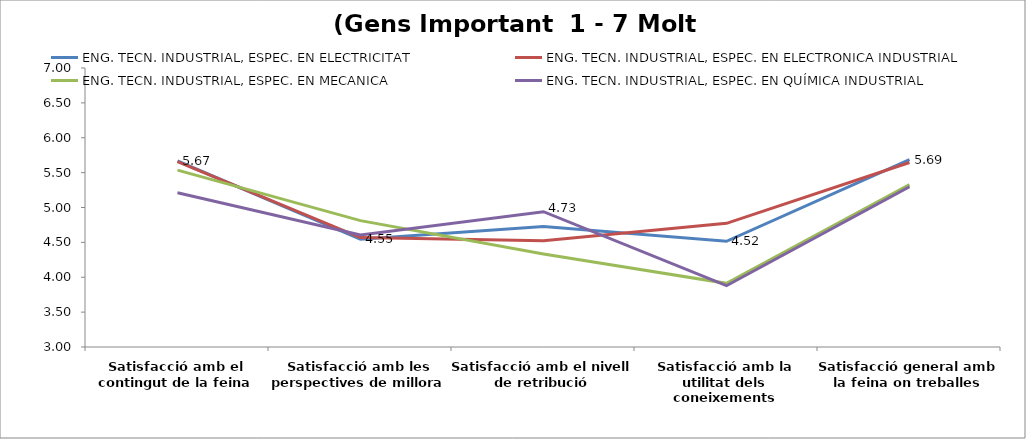
| Category | ENG. TECN. INDUSTRIAL, ESPEC. EN ELECTRICITAT | ENG. TECN. INDUSTRIAL, ESPEC. EN ELECTRONICA INDUSTRIAL | ENG. TECN. INDUSTRIAL, ESPEC. EN MECANICA | ENG. TECN. INDUSTRIAL, ESPEC. EN QUÍMICA INDUSTRIAL |
|---|---|---|---|---|
| Satisfacció amb el contingut de la feina | 5.667 | 5.659 | 5.536 | 5.212 |
| Satisfacció amb les perspectives de millora | 4.545 | 4.568 | 4.812 | 4.606 |
| Satisfacció amb el nivell de retribució | 4.727 | 4.523 | 4.333 | 4.939 |
| Satisfacció amb la utilitat dels coneixements | 4.515 | 4.773 | 3.913 | 3.879 |
| Satisfacció general amb la feina on treballes | 5.686 | 5.646 | 5.329 | 5.297 |